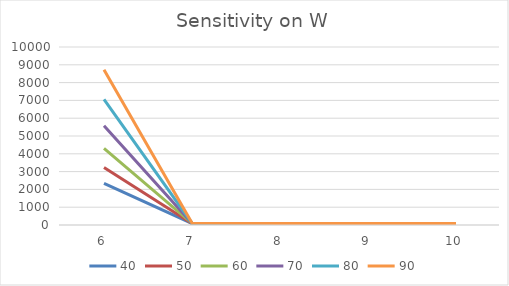
| Category | 40 | 50 | 60 | 70 | 80 | 90 |
|---|---|---|---|---|---|---|
| 6.0 | 2342.054 | 3225.33 | 4304.889 | 5580.731 | 7052.857 | 8721.266 |
| 7.0 | 86.195 | 89.741 | 94.075 | 99.198 | 105.108 | 111.806 |
| 8.0 | 79.753 | 80.787 | 82.05 | 83.544 | 85.267 | 87.22 |
| 9.0 | 78.072 | 78.451 | 78.913 | 79.46 | 80.091 | 80.806 |
| 10.0 | 77.478 | 77.625 | 77.804 | 78.016 | 78.26 | 78.537 |